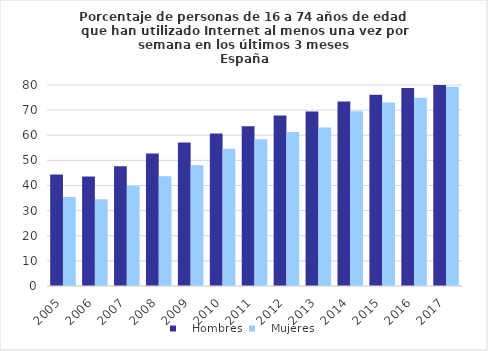
| Category |    Hombres |    Mujeres |
|---|---|---|
| 2005.0 | 44.351 | 35.402 |
| 2006.0 | 43.554 | 34.54 |
| 2007.0 | 47.63 | 39.792 |
| 2008.0 | 52.74 | 43.68 |
| 2009.0 | 57.078 | 48.07 |
| 2010.0 | 60.72 | 54.595 |
| 2011.0 | 63.618 | 58.432 |
| 2012.0 | 67.896 | 61.305 |
| 2013.0 | 69.412 | 63.07 |
| 2014.0 | 73.398 | 69.525 |
| 2015.0 | 76.16 | 72.996 |
| 2016.0 | 78.767 | 74.892 |
| 2017.0 | 80.8 | 79.3 |